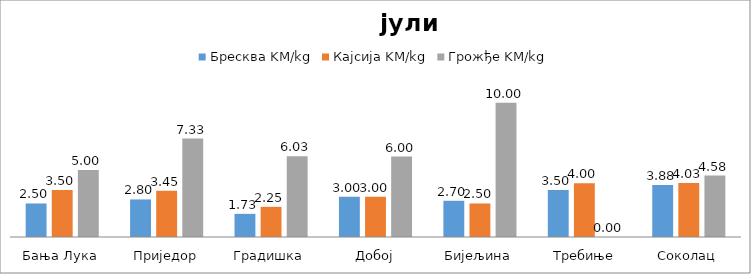
| Category | Бресква KM/kg | Кајсија KM/kg | Грожђе KM/kg |
|---|---|---|---|
| Бања Лука | 2.5 | 3.5 | 5 |
| Приједор | 2.8 | 3.45 | 7.333 |
| Градишка | 1.725 | 2.25 | 6.025 |
| Добој | 3 | 3 | 6 |
| Бијељина | 2.7 | 2.5 | 10 |
|  Требиње | 3.5 | 4 | 0 |
| Соколац | 3.875 | 4.025 | 4.575 |